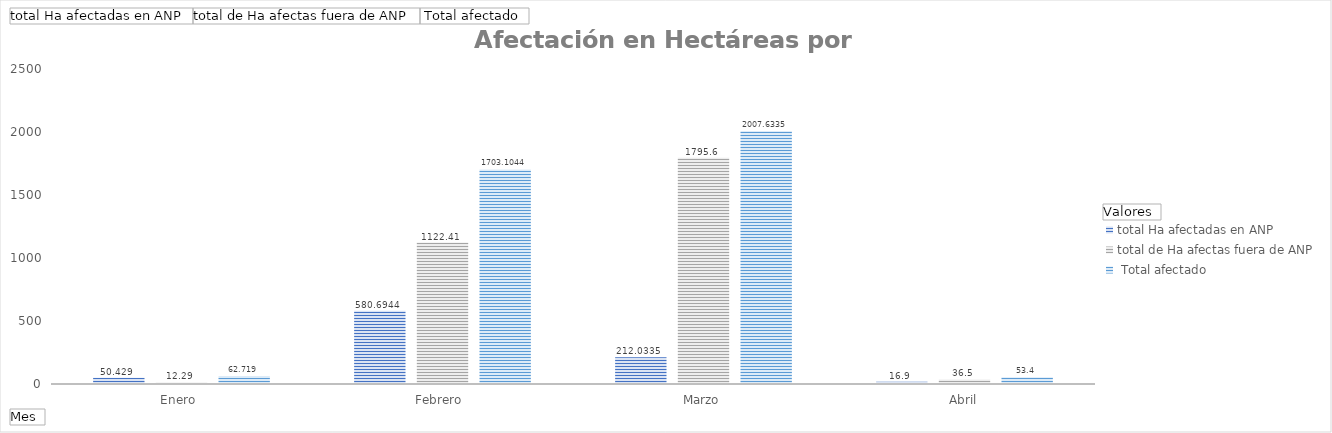
| Category | total Ha afectadas en ANP | total de Ha afectas fuera de ANP |  Total afectado |
|---|---|---|---|
| Enero  | 50.429 | 12.29 | 62.719 |
| Febrero  | 580.694 | 1122.41 | 1703.104 |
| Marzo | 212.034 | 1795.6 | 2007.634 |
| Abril | 16.9 | 36.5 | 53.4 |